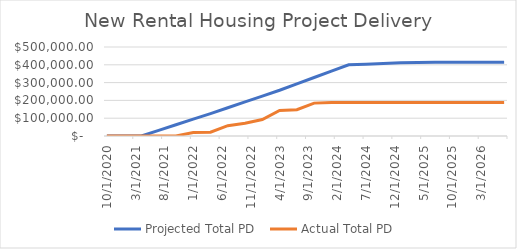
| Category | Projected Total PD  | Actual Total PD  |
|---|---|---|
| 10/1/20 | 0 | 0 |
| 1/1/21 | 0 | 0 |
| 4/1/21 | 0 | 0 |
| 7/1/21 | 31527.778 | 0 |
| 10/1/21 | 63055.556 | 0 |
| 1/1/22 | 94583.333 | 20106 |
| 4/1/22 | 126111.111 | 21518 |
| 7/1/22 | 158888.889 | 58004 |
| 10/1/22 | 191666.667 | 71275 |
| 1/1/23 | 224444.444 | 92643 |
| 4/1/23 | 257222.222 | 143099 |
| 7/1/23 | 292857.143 | 148090 |
| 10/1/23 | 328492.063 | 184706.17 |
| 1/1/24 | 364126.984 | 188211.17 |
| 4/1/24 | 399761.905 | 188211.17 |
| 7/1/24 | 403730.159 | 188211.17 |
| 10/1/24 | 407698.413 | 188211.17 |
| 1/1/25 | 411666.667 | 188211.17 |
| 4/1/25 | 412777.778 | 188211.17 |
| 7/1/25 | 413888.889 | 188211.17 |
| 10/1/25 | 415000 | 188211.17 |
| 1/1/26 | 415000 | 188211.17 |
| 4/1/26 | 415000 | 188211.17 |
| 7/1/26 | 415000 | 188211.17 |